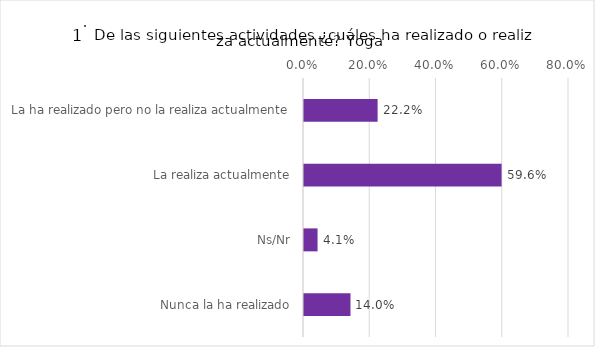
| Category | Series 0 |
|---|---|
| La ha realizado pero no la realiza actualmente | 0.222 |
| La realiza actualmente | 0.596 |
| Ns/Nr | 0.041 |
| Nunca la ha realizado | 0.14 |